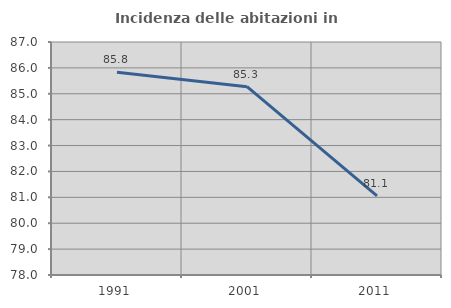
| Category | Incidenza delle abitazioni in proprietà  |
|---|---|
| 1991.0 | 85.831 |
| 2001.0 | 85.273 |
| 2011.0 | 81.057 |